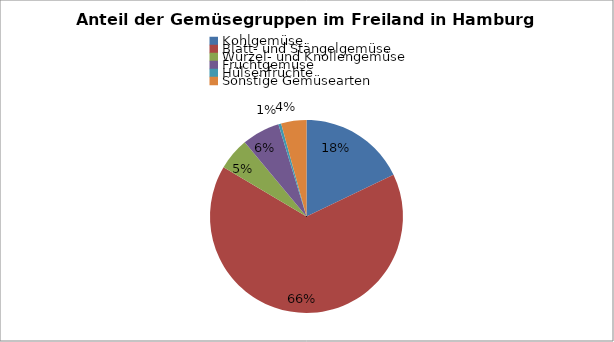
| Category | Series 0 |
|---|---|
| Kohlgemüse  | 76 |
| Blatt- und Stängelgemüse | 279 |
| Wurzel- und Knollengemüse | 23 |
| Fruchtgemüse | 27 |
| Hülsenfrüchte | 2 |
| Sonstige Gemüsearten | 18 |